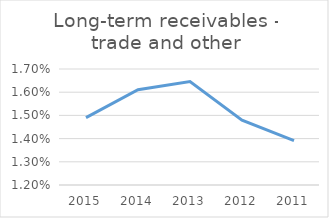
| Category | Long-term receivables - trade and other |
|---|---|
| 2015.0 | 0.015 |
| 2014.0 | 0.016 |
| 2013.0 | 0.016 |
| 2012.0 | 0.015 |
| 2011.0 | 0.014 |